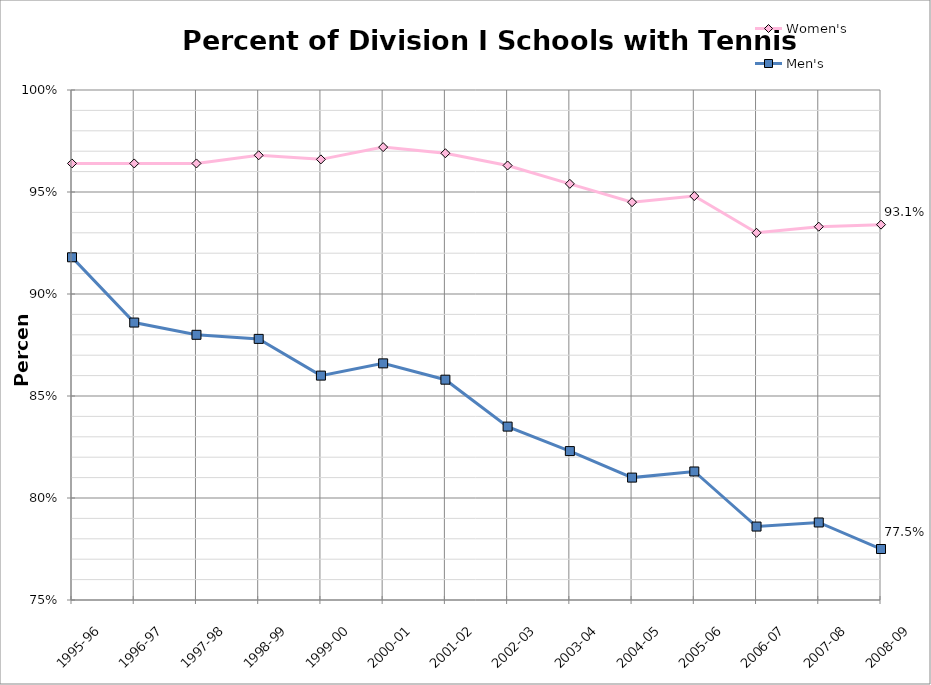
| Category | Women's | Men's |
|---|---|---|
| 1995-96 | 96.4 | 91.8 |
| 1996-97 | 96.4 | 88.6 |
| 1997-98 | 96.4 | 88 |
| 1998-99 | 96.8 | 87.8 |
| 1999-00 | 96.6 | 86 |
| 2000-01 | 97.2 | 86.6 |
| 2001-02 | 96.9 | 85.8 |
| 2002-03 | 96.3 | 83.5 |
| 2003-04 | 95.4 | 82.3 |
| 2004-05 | 94.5 | 81 |
| 2005-06 | 94.8 | 81.3 |
| 2006-07 | 93 | 78.6 |
| 2007-08 | 93.3 | 78.8 |
| 2008-09 | 93.4 | 77.5 |